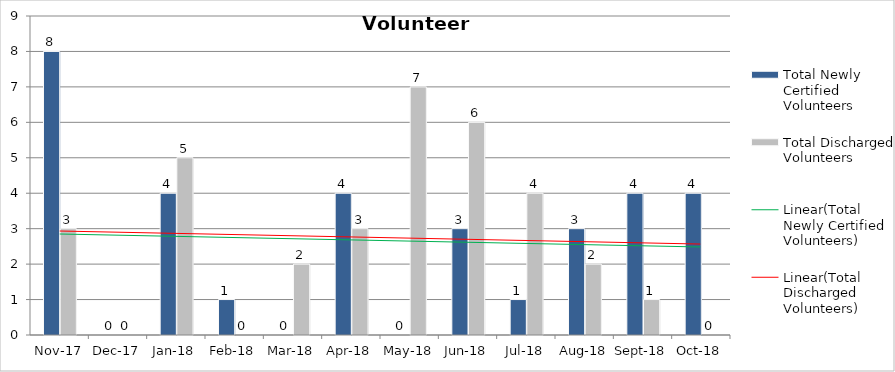
| Category | Total Newly Certified Volunteers | Total Discharged Volunteers |
|---|---|---|
| 2017-11-01 | 8 | 3 |
| 2017-12-01 | 0 | 0 |
| 2018-01-01 | 4 | 5 |
| 2018-02-01 | 1 | 0 |
| 2018-03-01 | 0 | 2 |
| 2018-04-01 | 4 | 3 |
| 2018-05-01 | 0 | 7 |
| 2018-06-01 | 3 | 6 |
| 2018-07-01 | 1 | 4 |
| 2018-08-01 | 3 | 2 |
| 2018-09-01 | 4 | 1 |
| 2018-10-01 | 4 | 0 |